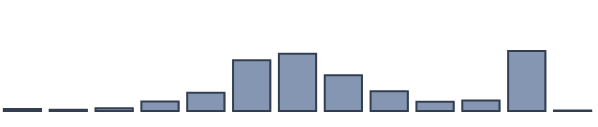
| Category | Series 0 |
|---|---|
| 0 | 0.694 |
| 1 | 0.408 |
| 2 | 0.976 |
| 3 | 3.379 |
| 4 | 6.563 |
| 5 | 18.3 |
| 6 | 20.635 |
| 7 | 12.927 |
| 8 | 7.152 |
| 9 | 3.344 |
| 10 | 3.772 |
| 11 | 21.635 |
| 12 | 0.216 |